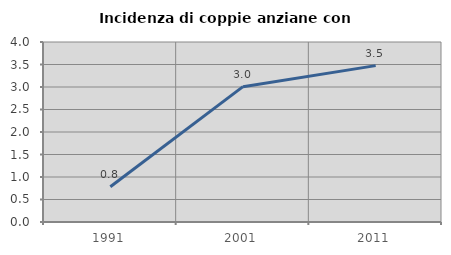
| Category | Incidenza di coppie anziane con figli |
|---|---|
| 1991.0 | 0.784 |
| 2001.0 | 3.008 |
| 2011.0 | 3.475 |